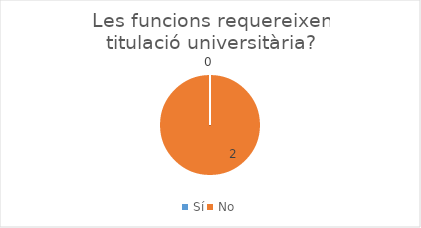
| Category | Series 0 |
|---|---|
| Sí | 0 |
| No | 2 |